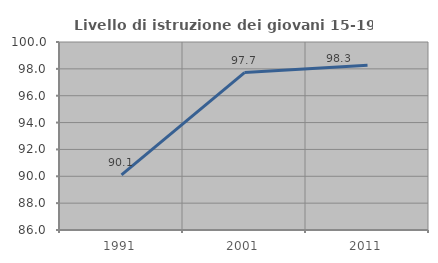
| Category | Livello di istruzione dei giovani 15-19 anni |
|---|---|
| 1991.0 | 90.104 |
| 2001.0 | 97.72 |
| 2011.0 | 98.261 |